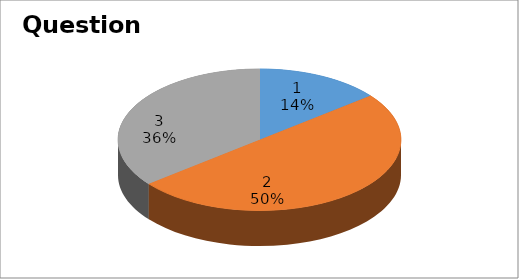
| Category | Series 0 |
|---|---|
| 0 | 2 |
| 1 | 7 |
| 2 | 5 |